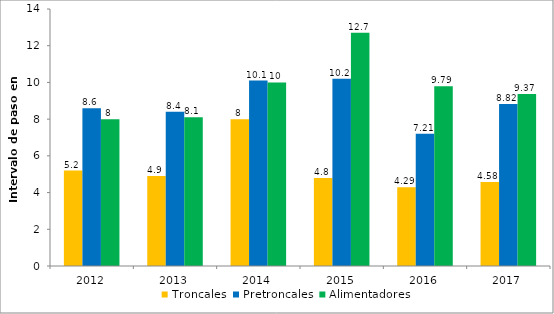
| Category | Troncales | Pretroncales | Alimentadores |
|---|---|---|---|
| 2012.0 | 5.2 | 8.6 | 8 |
| 2013.0 | 4.9 | 8.4 | 8.1 |
| 2014.0 | 8 | 10.1 | 10 |
| 2015.0 | 4.8 | 10.2 | 12.7 |
| 2016.0 | 4.29 | 7.21 | 9.79 |
| 2017.0 | 4.58 | 8.82 | 9.37 |